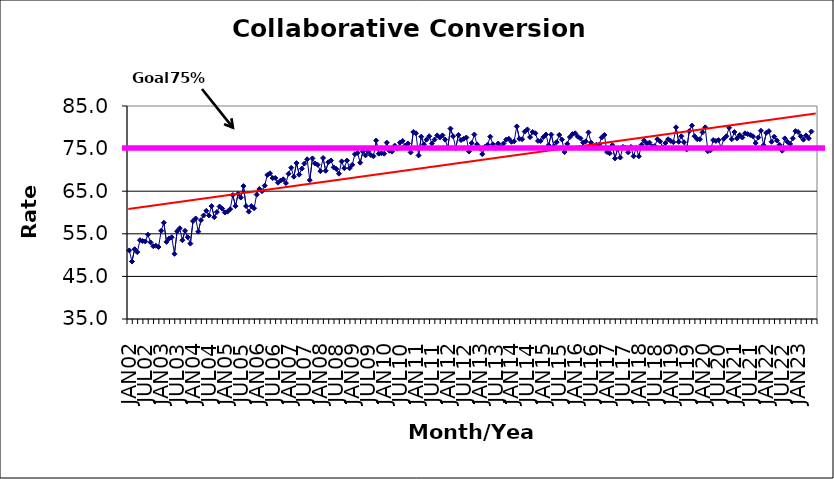
| Category | Series 0 |
|---|---|
| JAN02 | 51.1 |
| FEB02 | 48.5 |
| MAR02 | 51.4 |
| APR02 | 50.7 |
| MAY02 | 53.5 |
| JUN02 | 53.3 |
| JUL02 | 53.2 |
| AUG02 | 54.8 |
| SEP02 | 53 |
| OCT02 | 52.1 |
| NOV02 | 52.2 |
| DEC02 | 51.9 |
| JAN03 | 55.7 |
| FEB03 | 57.6 |
| MAR03 | 53.1 |
| APR03 | 53.9 |
| MAY03 | 54.2 |
| JUN03 | 50.3 |
| JUL03 | 55.6 |
| AUG03 | 56.3 |
| SEP03 | 53.5 |
| OCT03 | 55.7 |
| NOV03 | 54.2 |
| DEC03 | 52.7 |
| JAN04 | 58 |
| FEB04 | 58.6 |
| MAR04 | 55.5 |
| APR04 | 58.2 |
| MAY04 | 59.3 |
| JUN04 | 60.4 |
| JUL04 | 59.3 |
| AUG04 | 61.5 |
| SEP04 | 58.9 |
| OCT04 | 60.1 |
| NOV04 | 61.4 |
| DEC04 | 60.9 |
| JAN05 | 60 |
| FEB05 | 60.2 |
| MAR05 | 60.8 |
| APR05 | 64.1 |
| MAY05 | 61.5 |
| JUN05 | 64.4 |
| JUL05 | 63.5 |
| AUG05 | 66.2 |
| SEP05 | 61.5 |
| OCT05 | 60.2 |
| NOV05 | 61.5 |
| DEC05 | 61 |
| JAN06 | 64.2 |
| FEB06 | 65.5 |
| MAR06 | 65 |
| APR06 | 66.3 |
| MAY06 | 68.8 |
| JUN06 | 69.2 |
| JUL06 | 68.1 |
| AUG06 | 68.1 |
| SEP06 | 67 |
| OCT06 | 67.5 |
| NOV06 | 67.8 |
| DEC06 | 66.9 |
| JAN07 | 69.1 |
| FEB07 | 70.5 |
| MAR07 | 68.4 |
| APR07 | 71.6 |
| MAY07 | 68.9 |
| JUN07 | 70.3 |
| JUL07 | 71.5 |
| AUG07 | 72.5 |
| SEP07 | 67.6 |
| OCT07 | 72.7 |
| NOV07 | 71.5 |
| DEC07 | 71.2 |
| JAN08 | 69.7 |
| FEB08 | 72.8 |
| MAR08 | 69.8 |
| APR08 | 71.8 |
| MAY08 | 72.2 |
| JUN08 | 70.6 |
| JUL08 | 70.2 |
| AUG08 | 69.1 |
| SEP08 | 72 |
| OCT08 | 70.4 |
| NOV08 | 72.2 |
| DEC08 | 70.4 |
| JAN09 | 71.2 |
| FEB09 | 73.7 |
| MAR09 | 74 |
| APR09 | 71.7 |
| MAY09 | 74.3 |
| JUN09 | 73.4 |
| JUL09 | 74.3 |
| AUG09 | 73.5 |
| SEP09 | 73.2 |
| OCT09 | 76.9 |
| NOV09 | 73.8 |
| DEC09 | 73.9 |
| JAN10 | 73.8 |
| FEB10 | 76.4 |
| MAR10 | 74.5 |
| APR10 | 74.3 |
| MAY10 | 75.7 |
| JUN10 | 75 |
| JUL10 | 76.4 |
| AUG10 | 76.8 |
| SEP10 | 75.7 |
| OCT10 | 76.2 |
| NOV10 | 74.1 |
| DEC10 | 78.9 |
| JAN11 | 78.6 |
| FEB11 | 73.4 |
| MAR11 | 77.8 |
| APR11 | 76 |
| MAY11 | 77.1 |
| JUN11 | 77.9 |
| JUL11 | 76.2 |
| AUG11 | 77.1 |
| SEP11 | 78.1 |
| OCT11 | 77.6 |
| NOV11 | 78.1 |
| DEC11 | 77.1 |
| JAN12 | 75.2 |
| FEB12 | 79.7 |
| MAR12 | 77.9 |
| APR12 | 75.1 |
| MAY12 | 78.2 |
| JUN12 | 77 |
| JUL12 | 77.3 |
| AUG12 | 77.6 |
| SEP12 | 74.3 |
| OCT12 | 76.3 |
| NOV12 | 78.3 |
| DEC12 | 76 |
| JAN13 | 75.1 |
| FEB13 | 73.7 |
| MAR13 | 75.4 |
| APR13 | 75.9 |
| MAY13 | 77.8 |
| JUN13 | 76 |
| JUL13 | 75.1 |
| AUG13 | 76.2 |
| SEP13 | 75.4 |
| OCT13 | 76.2 |
| NOV13 | 77.1 |
| DEC13 | 77.3 |
| JAN14 | 76.6 |
| FEB14 | 76.7 |
| MAR14 | 80.2 |
| APR14 | 77.3 |
| MAY14 | 77.2 |
| JUN14 | 79 |
| JUL14 | 79.5 |
| AUG14 | 77.7 |
| SEP14 | 78.9 |
| OCT14 | 78.6 |
| NOV14 | 76.8 |
| DEC14 | 76.8 |
| JAN15 | 77.7 |
| FEB15 | 78.3 |
| MAR15 | 75.8 |
| APR15 | 78.3 |
| MAY15 | 75.6 |
| JUN15 | 76.5 |
| JUL15 | 78.2 |
| AUG15 | 77.1 |
| SEP15 | 74.2 |
| OCT15 | 76.1 |
| NOV15 | 77.7 |
| DEC15 | 78.4 |
| JAN16 | 78.6 |
| FEB16 | 77.8 |
| MAR16 | 77.4 |
| APR16 | 76.4 |
| MAY16 | 76.7 |
| JUN16 | 78.8 |
| JUL16 | 76.4 |
| AUG16 | 75.5 |
| SEP16 | 75.9 |
| OCT16 | 75.9 |
| NOV16 | 77.6 |
| DEC16 | 78.2 |
| JAN17 | 74.2 |
| FEB17 | 73.9 |
| MAR17 | 75.8 |
| APR17 | 72.7 |
| MAY17 | 75 |
| JUN17 | 72.9 |
| JUL17 | 75.4 |
| AUG17 | 75.2 |
| SEP17 | 74.1 |
| OCT17 | 75.4 |
| NOV17 | 73.2 |
| DEC17 | 75.2 |
| JAN18 | 73.2 |
| FEB18 | 75.9 |
| MAR18 | 76.9 |
| APR18 | 76.2 |
| MAY18 | 76.4 |
| JUN18 | 75.5 |
| JUL18 | 75.6 |
| AUG18 | 77.2 |
| SEP18 | 76.7 |
| OCT18 | 75.3 |
| NOV18 | 76.3 |
| DEC18 | 77.2 |
| JAN19 | 76.8 |
| FEB19 | 76.5 |
| MAR19 | 80 |
| APR19 | 76.6 |
| MAY19 | 77.9 |
| JUN19 | 76.5 |
| JUL19 | 74.8 |
| AUG19 | 79.1 |
| SEP19 | 80.4 |
| OCT19 | 77.9 |
| NOV19 | 77.2 |
| DEC19 | 77.2 |
| JAN20 | 78.8 |
| FEB20 | 80 |
| MAR20 | 74.4 |
| APR20 | 74.6 |
| MAY20 | 77 |
| JUN20 | 76.8 |
| JUL20 | 77 |
| AUG20 | 75.2 |
| SEP20 | 77.3 |
| OCT20 | 77.9 |
| NOV20 | 79.9 |
| DEC20 | 77.2 |
| JAN21 | 78.9 |
| FEB21 | 77.4 |
| MAR21 | 78.2 |
| APR21 | 77.6 |
| MAY21 | 78.6 |
| JUN21 | 78.4 |
| JUL21 | 78.2 |
| AUG21 | 77.9 |
| SEP21 | 76.3 |
| OCT21 | 77.6 |
| NOV21 | 79.2 |
| DEC21 | 75.8 |
| JAN22 | 78.7 |
| FEB22 | 79.1 |
| MAR22 | 76.6 |
| APR22 | 77.8 |
| MAY22 | 76.9 |
| JUN22 | 75.9 |
| JUL22 | 74.5 |
| AUG22 | 77.4 |
| SEP22 | 76.6 |
| OCT22 | 76.1 |
| NOV22 | 77.4 |
| DEC22 | 79.1 |
| JAN23 | 78.9 |
| FEB23 | 77.9 |
| MAR23 | 77.1 |
| APR23 | 78.1 |
| MAY23 | 77.4 |
| JUN23 | 79 |